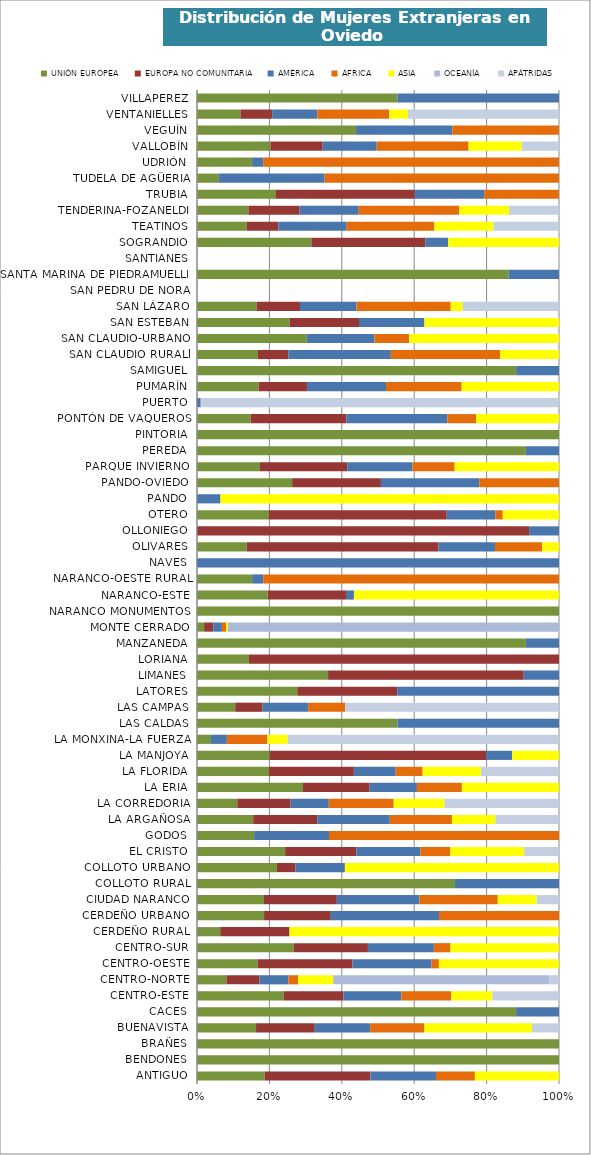
| Category | UNIÓN EUROPEA | EUROPA NO COMUNITARIA | AMÉRICA | ÁFRICA | ASIA | OCEANÍA | APÁTRIDAS |
|---|---|---|---|---|---|---|---|
| ANTIGUO | 0.02 | 0.031 | 0.019 | 0.011 | 0.024 | 0 | 0 |
| BENDONES | 0.002 | 0 | 0 | 0 | 0 | 0 | 0 |
| BRAÑES | 0.001 | 0 | 0 | 0 | 0 | 0 | 0 |
| BUENAVISTA | 0.048 | 0.047 | 0.045 | 0.044 | 0.086 | 0 | 0.022 |
| CACES | 0.001 | 0 | 0 | 0 | 0 | 0 | 0 |
| CENTRO-ESTE | 0.028 | 0.019 | 0.019 | 0.016 | 0.014 | 0 | 0.022 |
| CENTRO-NORTE | 0.068 | 0.076 | 0.067 | 0.022 | 0.081 | 0.5 | 0.022 |
| CENTRO-OESTE | 0.02 | 0.032 | 0.027 | 0.002 | 0.041 | 0 | 0 |
| CENTRO-SUR | 0.029 | 0.022 | 0.02 | 0.005 | 0.032 | 0 | 0 |
| CERDEÑO RURAL | 0 | 0.001 | 0 | 0 | 0.005 | 0 | 0 |
| CERDEÑO URBANO | 0.001 | 0.001 | 0.002 | 0.002 | 0 | 0 | 0 |
| CIUDAD NARANCO | 0.065 | 0.071 | 0.08 | 0.076 | 0.038 | 0 | 0.022 |
| COLLOTO RURAL | 0.001 | 0 | 0 | 0 | 0 | 0 | 0 |
| COLLOTO URBANO | 0.012 | 0.003 | 0.008 | 0 | 0.032 | 0 | 0 |
| EL CRISTO | 0.055 | 0.045 | 0.04 | 0.019 | 0.046 | 0 | 0.022 |
| GODOS | 0.002 | 0 | 0.002 | 0.008 | 0 | 0 | 0 |
| LA ARGAÑOSA | 0.077 | 0.088 | 0.099 | 0.085 | 0.059 | 0 | 0.087 |
| LA CORREDORIA | 0.054 | 0.071 | 0.051 | 0.086 | 0.068 | 0 | 0.152 |
| LA ERIA | 0.009 | 0.006 | 0.004 | 0.004 | 0.008 | 0 | 0 |
| LA FLORIDA | 0.02 | 0.024 | 0.012 | 0.008 | 0.016 | 0 | 0.022 |
| LA MANJOYA | 0.004 | 0.013 | 0.002 | 0 | 0.003 | 0 | 0 |
| LA MONXINA-LA FUERZA | 0.006 | 0 | 0.006 | 0.016 | 0.008 | 0 | 0.109 |
| LAS CALDAS | 0.001 | 0 | 0.001 | 0 | 0 | 0 | 0 |
| LAS CAMPAS | 0.012 | 0.008 | 0.014 | 0.011 | 0 | 0 | 0.065 |
| LATORES | 0.001 | 0.001 | 0.002 | 0 | 0 | 0 | 0 |
| LIMANES | 0.003 | 0.004 | 0.001 | 0 | 0 | 0 | 0 |
| LORIANA | 0 | 0.003 | 0 | 0 | 0 | 0 | 0 |
| MANZANEDA | 0.002 | 0 | 0 | 0 | 0 | 0 | 0 |
| MONTE CERRADO | 0.011 | 0.014 | 0.013 | 0.006 | 0.003 | 0.5 | 0 |
| NARANCO MONUMENTOS | 0.002 | 0 | 0 | 0 | 0 | 0 | 0 |
| NARANCO-ESTE | 0.004 | 0.004 | 0 | 0 | 0.011 | 0 | 0 |
| NARANCO-OESTE RURAL | 0.001 | 0 | 0 | 0.005 | 0 | 0 | 0 |
| NAVES | 0 | 0 | 0 | 0 | 0 | 0 | 0 |
| OLIVARES | 0.008 | 0.031 | 0.009 | 0.008 | 0.003 | 0 | 0 |
| OLLONIEGO | 0 | 0.008 | 0.001 | 0 | 0 | 0 | 0 |
| OTERO | 0.024 | 0.06 | 0.016 | 0.002 | 0.019 | 0 | 0 |
| PANDO | 0 | 0 | 0 | 0 | 0.003 | 0 | 0 |
| PANDO-OVIEDO | 0.007 | 0.007 | 0.008 | 0.006 | 0 | 0 | 0 |
| PARQUE INVIERNO | 0.013 | 0.018 | 0.014 | 0.009 | 0.022 | 0 | 0 |
| PEREDA | 0.002 | 0 | 0 | 0 | 0 | 0 | 0 |
| PINTORIA | 0.001 | 0 | 0 | 0 | 0 | 0 | 0 |
| PONTÓN DE VAQUEROS | 0.007 | 0.013 | 0.013 | 0.004 | 0.011 | 0 | 0 |
| PUERTO | 0 | 0 | 0.001 | 0 | 0 | 0 | 0.109 |
| PUMARÍN | 0.091 | 0.071 | 0.116 | 0.111 | 0.143 | 0 | 0 |
| SAMIGUEL | 0.001 | 0 | 0 | 0 | 0 | 0 | 0 |
| SAN CLAUDIO RURALl | 0.003 | 0.001 | 0.005 | 0.005 | 0.003 | 0 | 0 |
| SAN CLAUDIO-URBANO | 0.008 | 0 | 0.005 | 0.002 | 0.011 | 0 | 0 |
| SAN ESTEBAN | 0.002 | 0.001 | 0.001 | 0 | 0.003 | 0 | 0 |
| SAN LÁZARO | 0.014 | 0.01 | 0.013 | 0.021 | 0.003 | 0 | 0.022 |
| SAN PEDRU DE NORA | 0 | 0 | 0 | 0 | 0 | 0 | 0 |
| SANTA MARINA DE PIEDRAMUELLE | 0.002 | 0 | 0 | 0 | 0 | 0 | 0 |
| SANTIANES | 0 | 0 | 0 | 0 | 0 | 0 | 0 |
| SOGRANDIO | 0.003 | 0.003 | 0.001 | 0 | 0.003 | 0 | 0 |
| TEATINOS | 0.066 | 0.042 | 0.091 | 0.116 | 0.078 | 0 | 0.087 |
| TENDERINA-FOZANELDI | 0.045 | 0.045 | 0.051 | 0.088 | 0.043 | 0 | 0.043 |
| TRUBIA | 0.008 | 0.014 | 0.007 | 0.008 | 0 | 0 | 0 |
| TUDELA DE AGÜERIA | 0 | 0 | 0.002 | 0.005 | 0 | 0 | 0 |
| UDRIÓN | 0.001 | 0 | 0 | 0.005 | 0 | 0 | 0 |
| VALLOBÍN | 0.086 | 0.061 | 0.063 | 0.108 | 0.062 | 0 | 0.043 |
| VEGUÍN | 0.004 | 0 | 0.002 | 0.002 | 0 | 0 | 0 |
| VENTANIELLES | 0.044 | 0.032 | 0.045 | 0.072 | 0.019 | 0 | 0.152 |
| VILLAPEREZ | 0.001 | 0 | 0.001 | 0 | 0 | 0 | 0 |